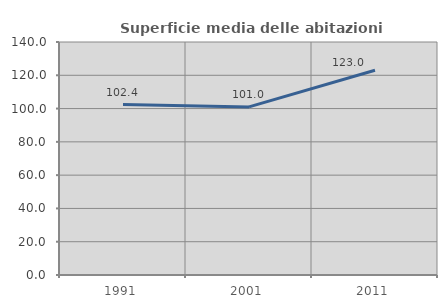
| Category | Superficie media delle abitazioni occupate |
|---|---|
| 1991.0 | 102.38 |
| 2001.0 | 101.018 |
| 2011.0 | 122.994 |